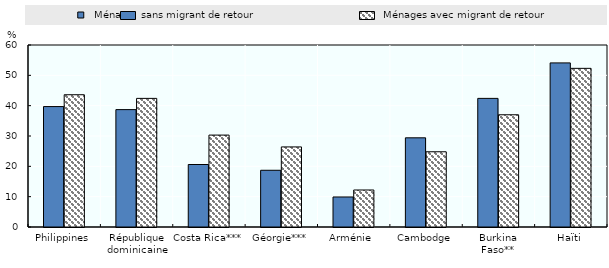
| Category |   Ménages sans migrant de retour |   Ménages avec migrant de retour |
|---|---|---|
| Philippines | 39.7 | 43.6 |
| République dominicaine | 38.7 | 42.4 |
| Costa Rica*** | 20.6 | 30.3 |
| Géorgie*** | 18.7 | 26.4 |
| Arménie  | 9.9 | 12.2 |
| Cambodge | 29.4 | 24.8 |
| Burkina Faso** | 42.4 | 37 |
| Haïti | 54.1 | 52.3 |